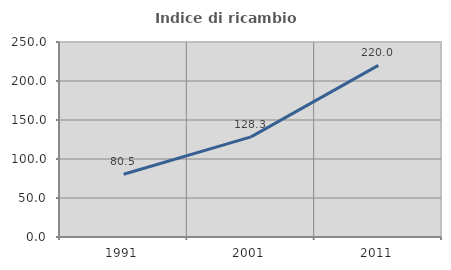
| Category | Indice di ricambio occupazionale  |
|---|---|
| 1991.0 | 80.519 |
| 2001.0 | 128.302 |
| 2011.0 | 220 |